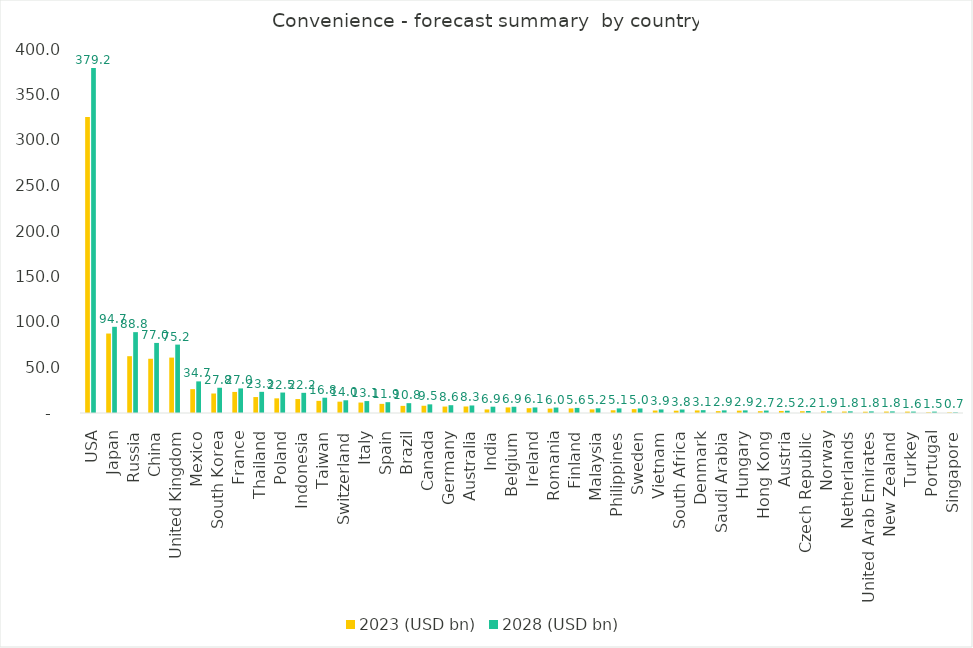
| Category | 2023 (USD bn) | 2028 (USD bn) |
|---|---|---|
| USA | 325.178 | 379.204 |
| Japan | 87.321 | 94.713 |
| Russia | 62.418 | 88.849 |
| China | 59.602 | 77.003 |
| United Kingdom | 60.877 | 75.156 |
| Mexico | 26.213 | 34.744 |
| South Korea | 21.424 | 27.751 |
| France | 23.157 | 27.025 |
| Thailand | 17.527 | 23.265 |
| Poland | 16.107 | 22.485 |
| Indonesia | 15.322 | 22.164 |
| Taiwan | 13.341 | 16.796 |
| Switzerland | 12.452 | 13.974 |
| Italy | 11.488 | 13.108 |
| Spain | 10.041 | 11.89 |
| Brazil | 7.836 | 10.809 |
| Canada | 7.966 | 9.503 |
| Germany | 7.082 | 8.569 |
| Australia | 7.148 | 8.264 |
| India | 3.929 | 6.923 |
| Belgium | 6.124 | 6.853 |
| Ireland | 5.294 | 6.106 |
| Romania | 4.83 | 5.987 |
| Finland | 5.015 | 5.615 |
| Malaysia | 3.97 | 5.194 |
| Philippines | 2.998 | 5.059 |
| Sweden | 4.274 | 5.008 |
| Vietnam | 2.706 | 3.917 |
| South Africa | 2.546 | 3.834 |
| Denmark | 2.837 | 3.127 |
| Saudi Arabia | 2.043 | 2.908 |
| Hungary | 2.584 | 2.894 |
| Hong Kong | 1.979 | 2.691 |
| Austria | 2.251 | 2.478 |
| Czech Republic | 1.949 | 2.194 |
| Norway | 1.806 | 1.898 |
| Netherlands | 1.595 | 1.84 |
| United Arab Emirates | 1.404 | 1.784 |
| New Zealand | 1.572 | 1.776 |
| Turkey | 1.522 | 1.562 |
| Portugal | 0.7 | 1.519 |
| Singapore | 0.581 | 0.667 |